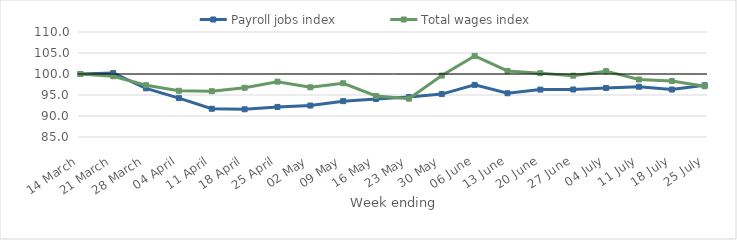
| Category | Payroll jobs index | Total wages index |
|---|---|---|
| 2020-03-14 | 100 | 100 |
| 2020-03-21 | 100.217 | 99.461 |
| 2020-03-28 | 96.587 | 97.329 |
| 2020-04-04 | 94.259 | 96.002 |
| 2020-04-11 | 91.726 | 95.904 |
| 2020-04-18 | 91.601 | 96.721 |
| 2020-04-25 | 92.161 | 98.178 |
| 2020-05-02 | 92.488 | 96.83 |
| 2020-05-09 | 93.537 | 97.798 |
| 2020-05-16 | 94.061 | 94.759 |
| 2020-05-23 | 94.527 | 94.129 |
| 2020-05-30 | 95.213 | 99.632 |
| 2020-06-06 | 97.411 | 104.317 |
| 2020-06-13 | 95.417 | 100.724 |
| 2020-06-20 | 96.283 | 100.184 |
| 2020-06-27 | 96.312 | 99.605 |
| 2020-07-04 | 96.679 | 100.677 |
| 2020-07-11 | 96.958 | 98.694 |
| 2020-07-18 | 96.299 | 98.333 |
| 2020-07-25 | 97.312 | 97.092 |